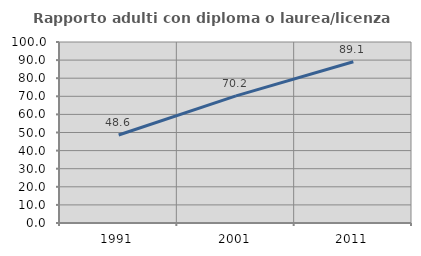
| Category | Rapporto adulti con diploma o laurea/licenza media  |
|---|---|
| 1991.0 | 48.636 |
| 2001.0 | 70.214 |
| 2011.0 | 89.095 |